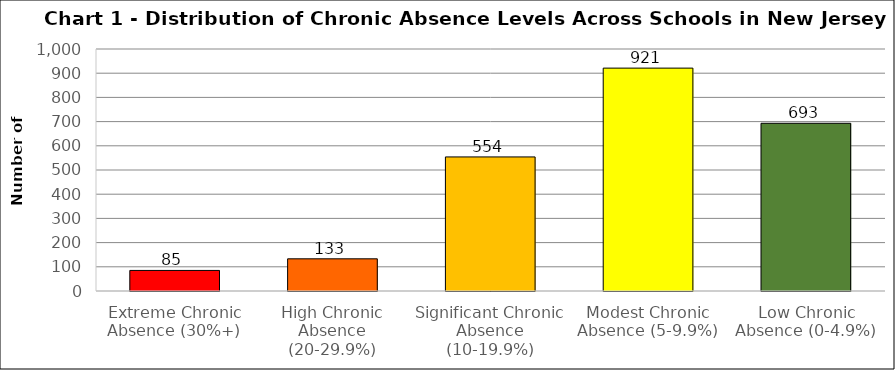
| Category | Series 0 |
|---|---|
| Extreme Chronic Absence (30%+) | 85 |
| High Chronic Absence (20-29.9%) | 133 |
| Significant Chronic Absence (10-19.9%) | 554 |
| Modest Chronic Absence (5-9.9%) | 921 |
| Low Chronic Absence (0-4.9%) | 693 |